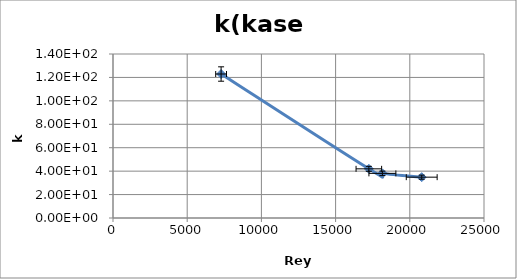
| Category | Series 0 |
|---|---|
| 20803.015094783164 | 34.857 |
| 18153.81690274741 | 38.102 |
| 17240.26998764141 | 41.973 |
| 7284.927523308795 | 122.915 |